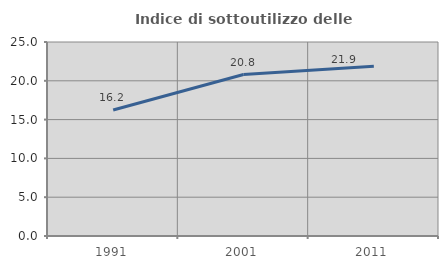
| Category | Indice di sottoutilizzo delle abitazioni  |
|---|---|
| 1991.0 | 16.244 |
| 2001.0 | 20.807 |
| 2011.0 | 21.885 |